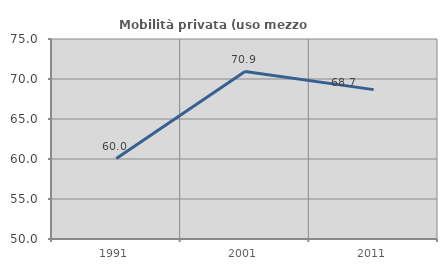
| Category | Mobilità privata (uso mezzo privato) |
|---|---|
| 1991.0 | 60.049 |
| 2001.0 | 70.927 |
| 2011.0 | 68.67 |